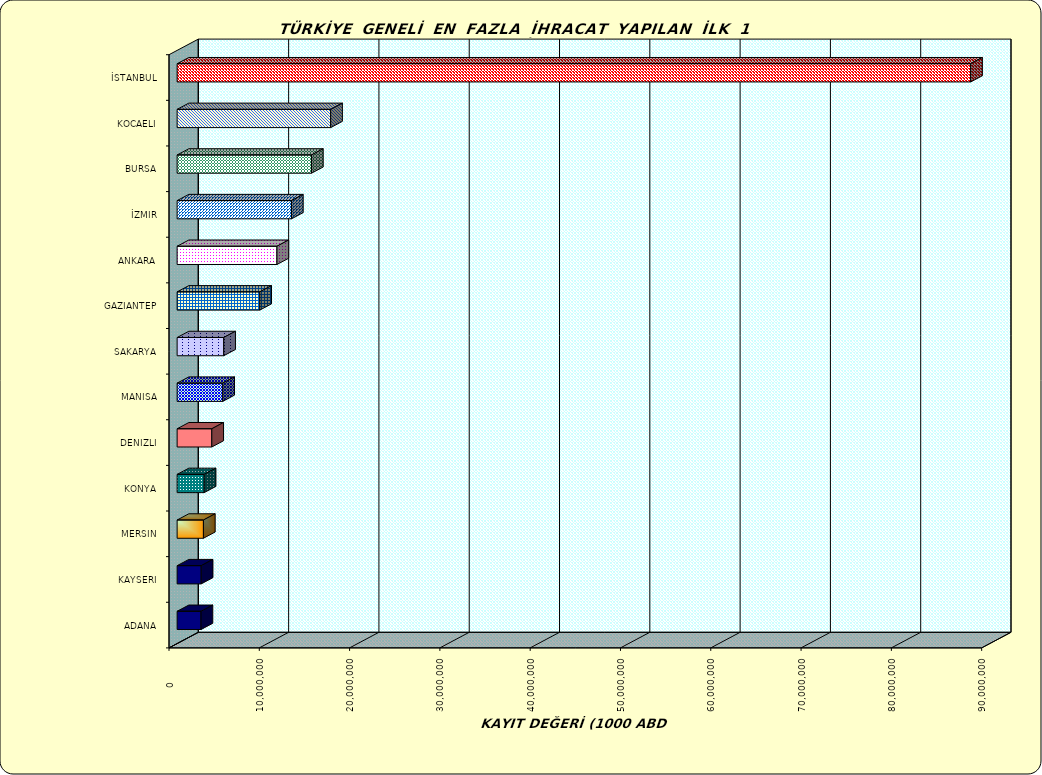
| Category | Series 0 |
|---|---|
| İSTANBUL | 87879666.811 |
| KOCAELI | 17003933.658 |
| BURSA | 14877508.019 |
| İZMIR | 12662137.779 |
| ANKARA | 11056187.162 |
| GAZIANTEP | 9152623.239 |
| SAKARYA | 5160383.287 |
| MANISA | 5054093.495 |
| DENIZLI | 3839178.546 |
| KONYA | 2995843.76 |
| MERSIN | 2911520.732 |
| KAYSERI | 2665659.926 |
| ADANA | 2647473.399 |